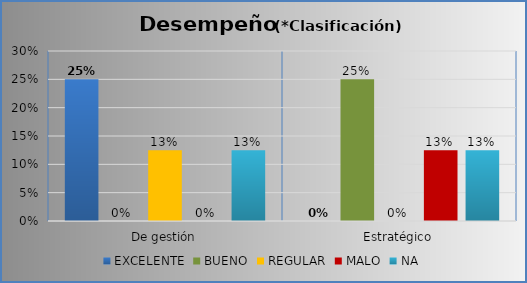
| Category | EXCELENTE | BUENO | REGULAR | MALO | NA |
|---|---|---|---|---|---|
| De gestión | 0.25 | 0 | 0.125 | 0 | 0.125 |
| Estratégico | 0 | 0.25 | 0 | 0.125 | 0.125 |